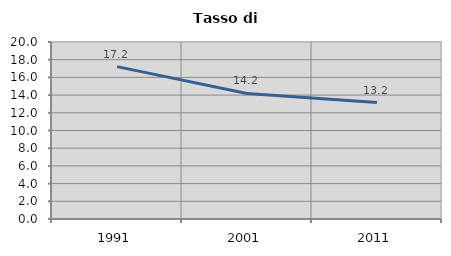
| Category | Tasso di disoccupazione   |
|---|---|
| 1991.0 | 17.221 |
| 2001.0 | 14.182 |
| 2011.0 | 13.157 |